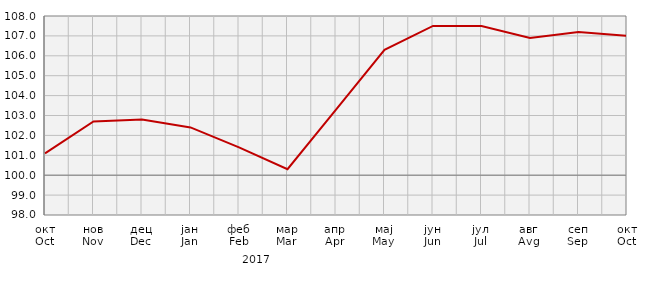
| Category | Индекси цијена произвођача
Producer price indices |
|---|---|
| окт
Oct | 101.1 |
| нов
Nov | 102.7 |
| дец
Dec | 102.8 |
| јан
Jan | 102.4 |
| феб
Feb | 101.4 |
| мар
Mar | 100.3 |
| апр
Apr | 103.3 |
| мај
May | 106.3 |
| јун
Jun | 107.5 |
| јул
Jul | 107.5 |
| авг
Avg | 106.9 |
| сеп
Sep | 107.2 |
| окт
Oct | 107 |